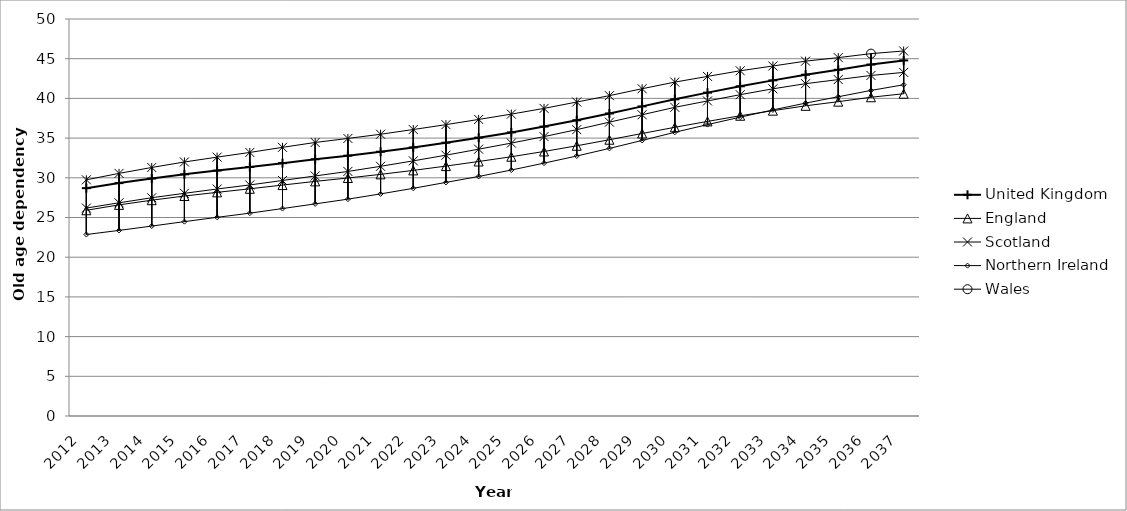
| Category | United Kingdom | England | Scotland | Northern Ireland | Wales |
|---|---|---|---|---|---|
| 2012.0 | 28.696 | 25.911 | 26.189 | 22.859 | 29.747 |
| 2013.0 | 29.332 | 26.588 | 26.85 | 23.374 | 30.557 |
| 2014.0 | 29.91 | 27.179 | 27.488 | 23.92 | 31.301 |
| 2015.0 | 30.438 | 27.706 | 28.048 | 24.48 | 31.992 |
| 2016.0 | 30.905 | 28.168 | 28.591 | 25.023 | 32.603 |
| 2017.0 | 31.36 | 28.613 | 29.099 | 25.547 | 33.194 |
| 2018.0 | 31.847 | 29.084 | 29.663 | 26.127 | 33.834 |
| 2019.0 | 32.336 | 29.548 | 30.234 | 26.716 | 34.451 |
| 2020.0 | 32.79 | 29.975 | 30.801 | 27.309 | 34.957 |
| 2021.0 | 33.282 | 30.433 | 31.446 | 27.971 | 35.485 |
| 2022.0 | 33.829 | 30.933 | 32.134 | 28.675 | 36.08 |
| 2023.0 | 34.422 | 31.476 | 32.846 | 29.419 | 36.695 |
| 2024.0 | 35.057 | 32.054 | 33.605 | 30.168 | 37.349 |
| 2025.0 | 35.718 | 32.652 | 34.372 | 30.977 | 38.02 |
| 2026.0 | 36.452 | 33.316 | 35.189 | 31.85 | 38.741 |
| 2027.0 | 37.247 | 34.032 | 36.066 | 32.742 | 39.543 |
| 2028.0 | 38.103 | 34.794 | 37.011 | 33.701 | 40.347 |
| 2029.0 | 38.993 | 35.58 | 37.941 | 34.705 | 41.218 |
| 2030.0 | 39.885 | 36.362 | 38.877 | 35.732 | 42.05 |
| 2031.0 | 40.725 | 37.103 | 39.677 | 36.699 | 42.77 |
| 2032.0 | 41.526 | 37.813 | 40.469 | 37.634 | 43.481 |
| 2033.0 | 42.27 | 38.453 | 41.207 | 38.549 | 44.081 |
| 2034.0 | 42.988 | 39.066 | 41.856 | 39.404 | 44.692 |
| 2035.0 | 43.604 | 39.586 | 42.368 | 40.21 | 45.134 |
| 2036.0 | 44.264 | 40.144 | 42.889 | 41.004 | 45.637 |
| 2037.0 | 44.783 | 40.587 | 43.275 | 41.717 | 45.973 |